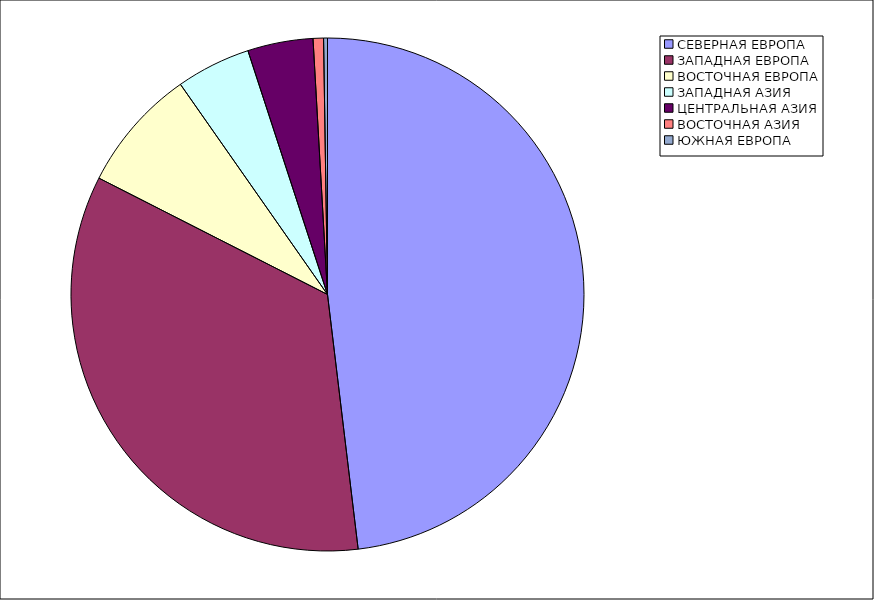
| Category | Оборот |
|---|---|
| СЕВЕРНАЯ ЕВРОПА | 48.092 |
| ЗАПАДНАЯ ЕВРОПА | 34.402 |
| ВОСТОЧНАЯ ЕВРОПА | 7.787 |
| ЗАПАДНАЯ АЗИЯ | 4.697 |
| ЦЕНТРАЛЬНАЯ АЗИЯ | 4.121 |
| ВОСТОЧНАЯ АЗИЯ | 0.656 |
| ЮЖНАЯ ЕВРОПА | 0.245 |